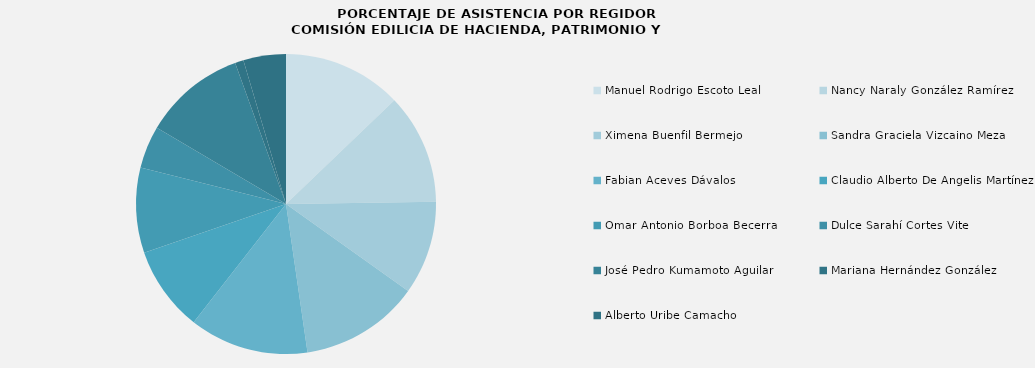
| Category | Series 0 |
|---|---|
| Manuel Rodrigo Escoto Leal | 100 |
| Nancy Naraly González Ramírez | 92.857 |
| Ximena Buenfil Bermejo | 78.571 |
| Sandra Graciela Vizcaino Meza | 100 |
| Fabian Aceves Dávalos | 100 |
| Claudio Alberto De Angelis Martínez | 71.429 |
| Omar Antonio Borboa Becerra | 71.429 |
| Dulce Sarahí Cortes Vite | 35.714 |
| José Pedro Kumamoto Aguilar | 85.714 |
| Mariana Hernández González | 7.143 |
| Alberto Uribe Camacho | 35.714 |